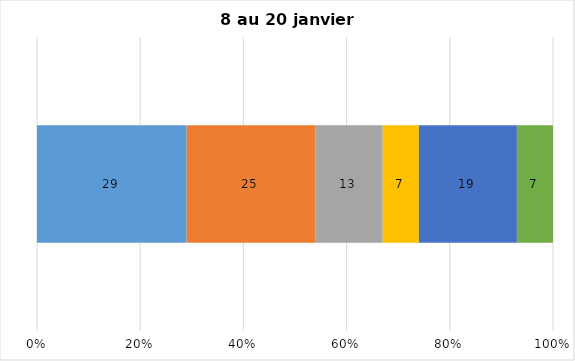
| Category | Plusieurs fois par jour | Une fois par jour | Quelques fois par semaine   | Une fois par semaine ou moins   |  Jamais   |  Je n’utilise pas les médias sociaux |
|---|---|---|---|---|---|---|
| 0 | 29 | 25 | 13 | 7 | 19 | 7 |